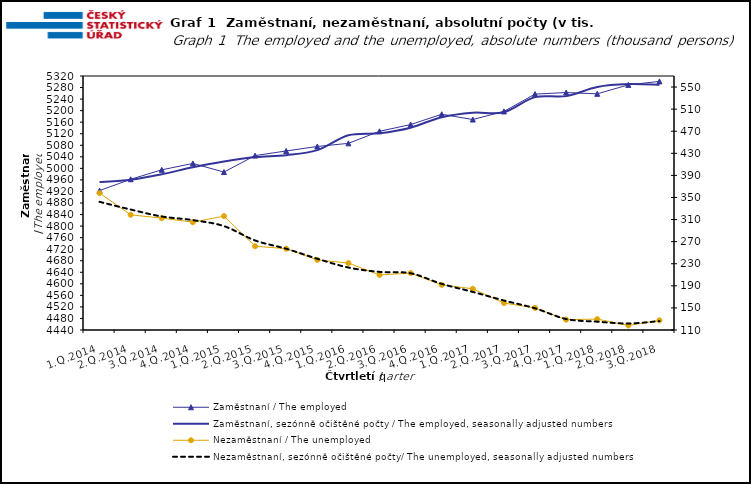
| Category | Zaměstnaní / The employed | Zaměstnaní, sezónně očištěné počty / The employed, seasonally adjusted numbers |
|---|---|---|
| 1.Q.2014 | 4922.963 | 4952.405 |
| 2.Q.2014 | 4962.219 | 4960.65 |
| 3.Q.2014 | 4994.947 | 4979.618 |
| 4.Q.2014 | 5017.051 | 5003.629 |
| 1.Q.2015 | 4987.141 | 5023.827 |
| 2.Q.2015 | 5044.285 | 5038.984 |
| 3.Q.2015 | 5060.3 | 5045.647 |
| 4.Q.2015 | 5075.884 | 5063.085 |
| 1.Q.2016 | 5086.671 | 5114.698 |
| 2.Q.2016 | 5128.493 | 5121.602 |
| 3.Q.2016 | 5151.712 | 5140.967 |
| 4.Q.2016 | 5187.436 | 5177.35 |
| 1.Q.2017 | 5169.203 | 5192.941 |
| 2.Q.2017 | 5197.265 | 5194.555 |
| 3.Q.2017 | 5257.26 | 5246.726 |
| 4.Q.2017 | 5262.691 | 5250.237 |
| 1.Q.2018 | 5258.225 | 5281.99 |
| 2.Q.2018 | 5289.242 | 5291.982 |
| 3.Q.2018 | 5301.361 | 5289.641 |